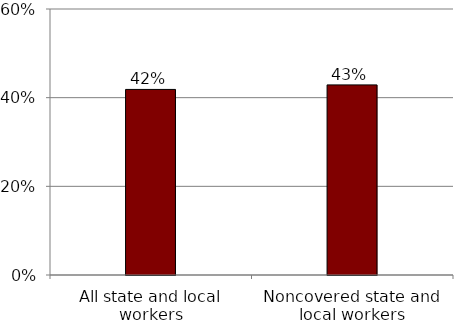
| Category | Series 0 |
|---|---|
| All state and local workers | 0.419 |
| Noncovered state and local workers | 0.429 |